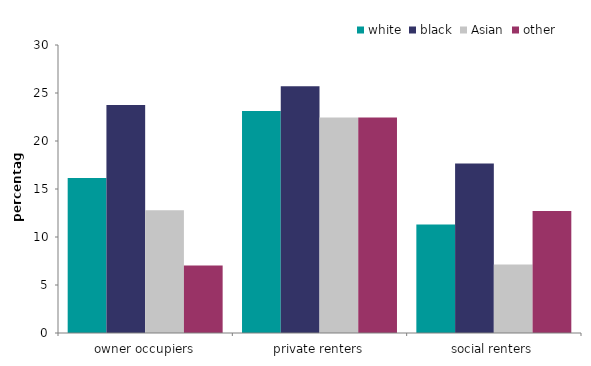
| Category | white | black | Asian | other |
|---|---|---|---|---|
| owner occupiers | 16.145 | 23.763 | 12.795 | 7.042 |
| private renters | 23.115 | 25.716 | 22.444 | 22.45 |
| social renters | 11.314 | 17.648 | 7.138 | 12.707 |